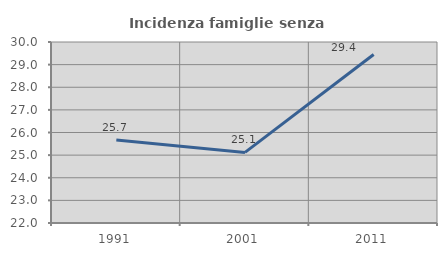
| Category | Incidenza famiglie senza nuclei |
|---|---|
| 1991.0 | 25.664 |
| 2001.0 | 25.12 |
| 2011.0 | 29.447 |